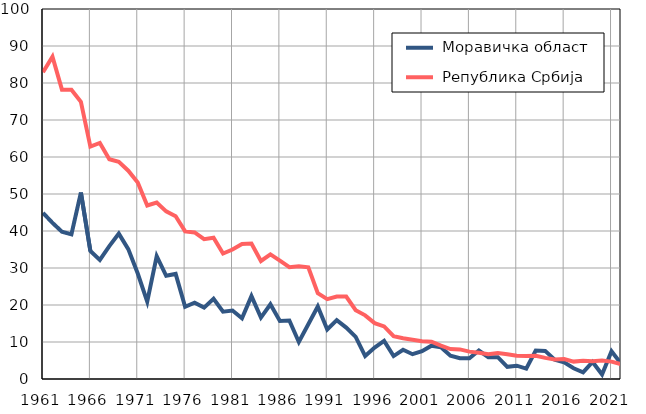
| Category |  Моравичка област |  Република Србија |
|---|---|---|
| 1961.0 | 44.9 | 82.9 |
| 1962.0 | 42.2 | 87.1 |
| 1963.0 | 39.8 | 78.2 |
| 1964.0 | 39.1 | 78.2 |
| 1965.0 | 50.4 | 74.9 |
| 1966.0 | 34.6 | 62.8 |
| 1967.0 | 32.2 | 63.8 |
| 1968.0 | 35.9 | 59.4 |
| 1969.0 | 39.3 | 58.7 |
| 1970.0 | 35.1 | 56.3 |
| 1971.0 | 28.5 | 53.1 |
| 1972.0 | 20.9 | 46.9 |
| 1973.0 | 33.2 | 47.7 |
| 1974.0 | 27.9 | 45.3 |
| 1975.0 | 28.4 | 44 |
| 1976.0 | 19.5 | 39.9 |
| 1977.0 | 20.6 | 39.6 |
| 1978.0 | 19.3 | 37.8 |
| 1979.0 | 21.7 | 38.2 |
| 1980.0 | 18.2 | 33.9 |
| 1981.0 | 18.5 | 35 |
| 1982.0 | 16.4 | 36.5 |
| 1983.0 | 22.4 | 36.6 |
| 1984.0 | 16.6 | 31.9 |
| 1985.0 | 20.2 | 33.7 |
| 1986.0 | 15.7 | 32 |
| 1987.0 | 15.8 | 30.2 |
| 1988.0 | 10 | 30.5 |
| 1989.0 | 14.8 | 30.2 |
| 1990.0 | 19.6 | 23.2 |
| 1991.0 | 13.4 | 21.6 |
| 1992.0 | 15.9 | 22.3 |
| 1993.0 | 13.9 | 22.3 |
| 1994.0 | 11.4 | 18.6 |
| 1995.0 | 6.2 | 17.2 |
| 1996.0 | 8.5 | 15.1 |
| 1997.0 | 10.3 | 14.2 |
| 1998.0 | 6.2 | 11.6 |
| 1999.0 | 7.9 | 11 |
| 2000.0 | 6.7 | 10.6 |
| 2001.0 | 7.5 | 10.2 |
| 2002.0 | 9 | 10.1 |
| 2003.0 | 8.6 | 9 |
| 2004.0 | 6.3 | 8.1 |
| 2005.0 | 5.6 | 8 |
| 2006.0 | 5.6 | 7.4 |
| 2007.0 | 7.7 | 7.1 |
| 2008.0 | 5.9 | 6.7 |
| 2009.0 | 5.9 | 7 |
| 2010.0 | 3.3 | 6.7 |
| 2011.0 | 3.6 | 6.3 |
| 2012.0 | 2.8 | 6.2 |
| 2013.0 | 7.7 | 6.3 |
| 2014.0 | 7.6 | 5.7 |
| 2015.0 | 5.2 | 5.3 |
| 2016.0 | 4.5 | 5.4 |
| 2017.0 | 2.9 | 4.7 |
| 2018.0 | 1.8 | 4.9 |
| 2019.0 | 4.6 | 4.8 |
| 2020.0 | 1.2 | 5 |
| 2021.0 | 7.5 | 4.7 |
| 2022.0 | 4.2 | 4 |